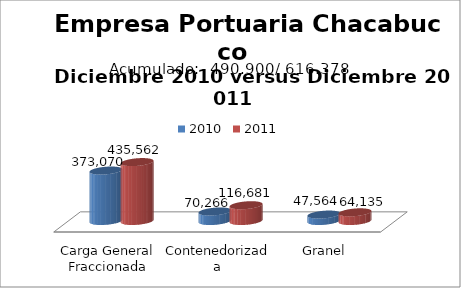
| Category | 2010 | 2011 |
|---|---|---|
| Carga General Fraccionada | 373070 | 435562 |
| Contenedorizada | 70266 | 116681 |
| Granel | 47564 | 64135 |